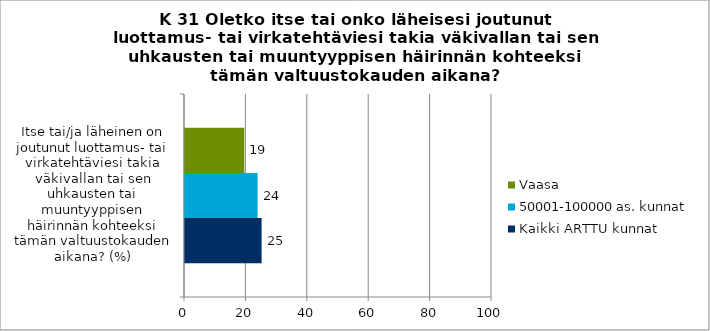
| Category | Kaikki ARTTU kunnat | 50001-100000 as. kunnat | Vaasa |
|---|---|---|---|
| Itse tai/ja läheinen on joutunut luottamus- tai virkatehtäviesi takia väkivallan tai sen uhkausten tai muuntyyppisen häirinnän kohteeksi tämän valtuustokauden aikana? (%) | 24.952 | 23.653 | 19.298 |